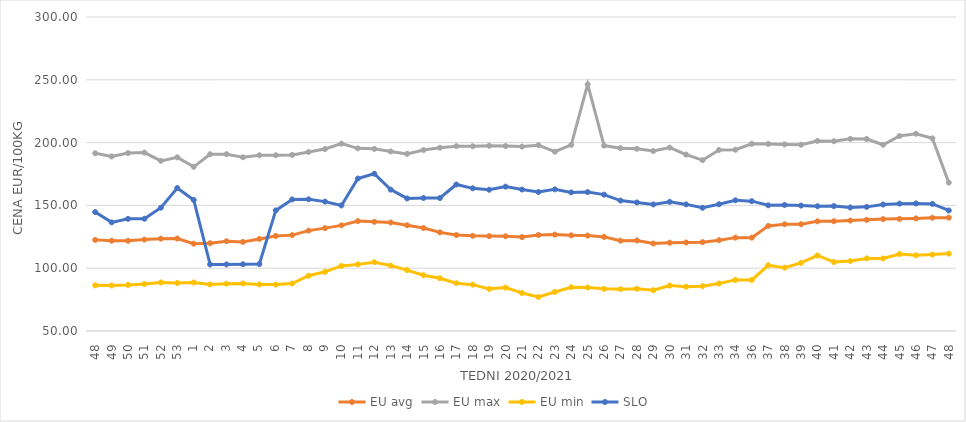
| Category | EU avg | EU max | EU min | SLO |
|---|---|---|---|---|
| 48.0 | 122.553 | 191.52 | 86.35 | 144.69 |
| 49.0 | 121.893 | 188.97 | 86.24 | 136.47 |
| 50.0 | 121.851 | 191.67 | 86.72 | 139.29 |
| 51.0 | 122.8 | 192.06 | 87.5 | 139.35 |
| 52.0 | 123.52 | 185.468 | 88.67 | 148.16 |
| 53.0 | 123.611 | 188.25 | 88.23 | 163.81 |
| 1.0 | 119.553 | 180.72 | 88.64 | 154.31 |
| 2.0 | 119.893 | 190.77 | 87.1 | 103.02 |
| 3.0 | 121.489 | 190.76 | 87.7 | 103.03 |
| 4.0 | 120.954 | 188.33 | 87.88 | 103.15 |
| 5.0 | 123.293 | 189.91 | 87.04 | 103.34 |
| 6.0 | 125.679 | 189.94 | 86.97 | 146.03 |
| 7.0 | 126.33 | 190.21 | 87.79 | 154.77 |
| 8.0 | 129.933 | 192.48 | 94.02 | 154.86 |
| 9.0 | 131.908 | 194.884 | 97.12 | 153 |
| 10.0 | 134.098 | 199.17 | 101.79 | 149.98 |
| 11.0 | 137.49 | 195.419 | 103.05 | 171.4 |
| 12.0 | 136.929 | 195.013 | 104.76 | 175.2 |
| 13.0 | 136.39 | 192.952 | 102.11 | 162.57 |
| 14.0 | 134.198 | 191.034 | 98.5 | 155.55 |
| 15.0 | 132.003 | 194.047 | 94.39 | 155.88 |
| 16.0 | 128.53 | 195.913 | 92.04 | 155.88 |
| 17.0 | 126.415 | 197.188 | 88.07 | 166.66 |
| 18.0 | 125.787 | 197.055 | 86.89 | 163.58 |
| 19.0 | 125.54 | 197.478 | 83.546 | 162.44 |
| 20.0 | 125.412 | 197.263 | 84.55 | 164.94 |
| 21.0 | 124.768 | 196.821 | 80.264 | 162.64 |
| 22.0 | 126.43 | 197.963 | 77.048 | 160.68 |
| 23.0 | 126.76 | 192.72 | 81.087 | 162.75 |
| 24.0 | 126.19 | 198.186 | 84.83 | 160.34 |
| 25.0 | 125.97 | 246.36 | 84.63 | 160.6 |
| 26.0 | 124.92 | 197.607 | 83.57 | 158.57 |
| 27.0 | 121.922 | 195.566 | 83.3 | 153.83 |
| 28.0 | 122.106 | 195.043 | 83.64 | 152.35 |
| 29.0 | 119.659 | 193.272 | 82.49 | 150.79 |
| 30.0 | 120.3 | 196.01 | 86.16 | 152.82 |
| 31.0 | 120.473 | 190.42 | 85.26 | 150.8 |
| 32.0 | 120.756 | 186 | 85.65 | 148.1 |
| 33.0 | 122.274 | 194.145 | 87.8 | 150.88 |
| 34.0 | 124.332 | 194.304 | 90.69 | 154.04 |
| 36.0 | 124.332 | 199.06 | 90.69 | 153.37 |
| 37.0 | 133.685 | 198.97 | 102.334 | 150.06 |
| 38.0 | 134.959 | 198.57 | 100.43 | 150.32 |
| 39.0 | 135.021 | 198.3 | 104.21 | 149.86 |
| 40.0 | 137.315 | 201.34 | 110.15 | 149.34 |
| 41.0 | 137.411 | 201.081 | 104.9 | 149.48 |
| 42.0 | 137.908 | 202.98 | 105.65 | 148.32 |
| 43.0 | 138.52 | 202.856 | 107.8 | 148.83 |
| 44.0 | 139.076 | 198.26 | 107.75 | 150.69 |
| 45.0 | 139.275 | 205.257 | 111.25 | 151.41 |
| 46.0 | 139.626 | 207.046 | 110.26 | 151.56 |
| 47.0 | 140.17 | 203.387 | 110.83 | 151.2 |
| 48.0 | 140.248 | 168.092 | 111.62 | 145.97 |